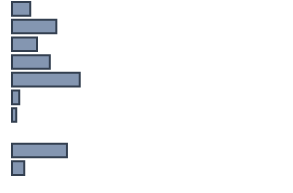
| Category | Series 0 |
|---|---|
| 0 | 6.7 |
| 1 | 16.3 |
| 2 | 9.2 |
| 3 | 13.9 |
| 4 | 24.9 |
| 5 | 2.7 |
| 6 | 1.6 |
| 7 | 0 |
| 8 | 20.2 |
| 9 | 4.5 |